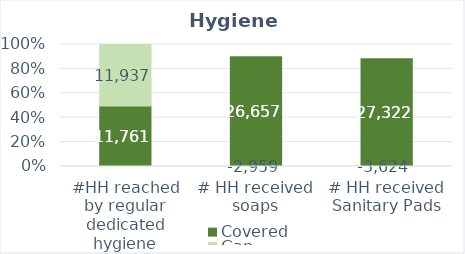
| Category | Covered | Gap |
|---|---|---|
| #HH reached by regular dedicated hygiene promotion | 11760.6 | 11937.4 |
| # HH received soaps | 26657 | -2959 |
| # HH received Sanitary Pads | 27322 | -3624 |